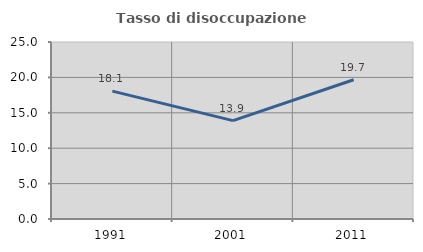
| Category | Tasso di disoccupazione giovanile  |
|---|---|
| 1991.0 | 18.059 |
| 2001.0 | 13.889 |
| 2011.0 | 19.665 |